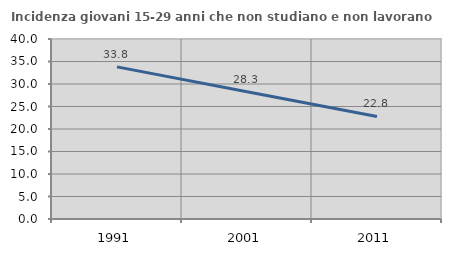
| Category | Incidenza giovani 15-29 anni che non studiano e non lavorano  |
|---|---|
| 1991.0 | 33.803 |
| 2001.0 | 28.271 |
| 2011.0 | 22.797 |